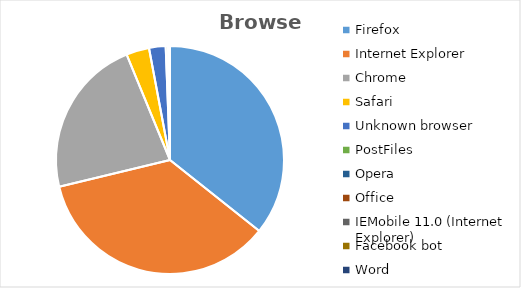
| Category | Series 0 |
|---|---|
| Firefox | 723120 |
| Internet Explorer | 719995 |
| Chrome | 457362 |
| Safari | 65929 |
| Unknown browser | 47563 |
| PostFiles | 6433 |
| Opera | 3566 |
| Office | 1414 |
| IEMobile 11.0 (Internet Explorer) | 481 |
| Facebook bot | 264 |
| Word | 136 |